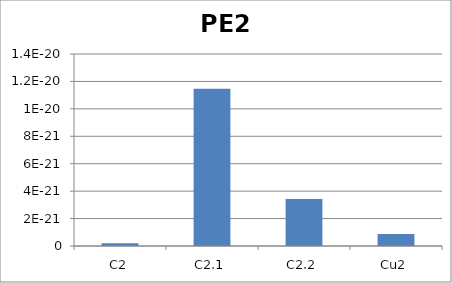
| Category | Series 0 |
|---|---|
| C2 | 0 |
| C2.1 | 0 |
| C2.2 | 0 |
| Cu2 | 0 |